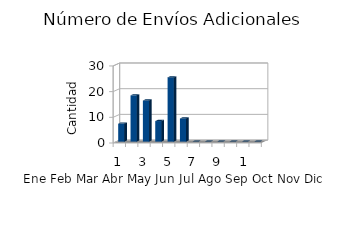
| Category | Series 0 |
|---|---|
| 0 | 7 |
| 1 | 18 |
| 2 | 16 |
| 3 | 8 |
| 4 | 25 |
| 5 | 9 |
| 6 | 0 |
| 7 | 0 |
| 8 | 0 |
| 9 | 0 |
| 10 | 0 |
| 11 | 0 |